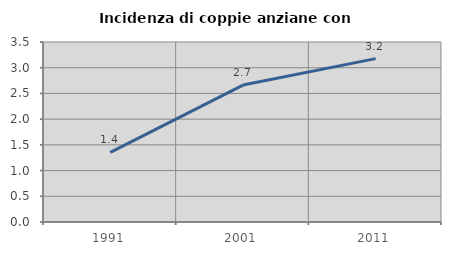
| Category | Incidenza di coppie anziane con figli |
|---|---|
| 1991.0 | 1.355 |
| 2001.0 | 2.663 |
| 2011.0 | 3.177 |